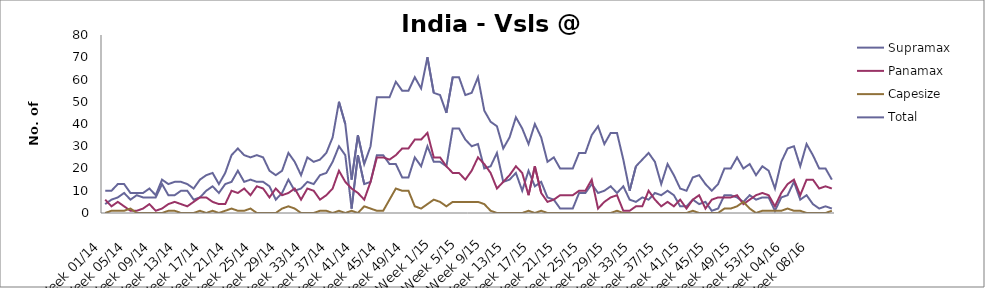
| Category | Supramax | Panamax | Capesize | Total |
|---|---|---|---|---|
| Week 01/14 | 4 | 6 | 0 | 10 |
| Week 02/14 | 6 | 3 | 1 | 10 |
| Week 03/14 | 7 | 5 | 1 | 13 |
| Week 04/14 | 9 | 3 | 1 | 13 |
| Week 05/14 | 6 | 1 | 2 | 9 |
| Week 06/14 | 8 | 1 | 0 | 9 |
| Week 07/14 | 7 | 2 | 0 | 9 |
| Week 08/14 | 7 | 4 | 0 | 11 |
| Week 09/14 | 7 | 1 | 0 | 8 |
| Week 10/14 | 13 | 2 | 0 | 15 |
| Week 11/14 | 8 | 4 | 1 | 13 |
| Week 12/14 | 8 | 5 | 1 | 14 |
| Week 13/14 | 10 | 4 | 0 | 14 |
| Week 14/14 | 10 | 3 | 0 | 13 |
| Week 15/14 | 6 | 5 | 0 | 11 |
| Week 16/14 | 7 | 7 | 1 | 15 |
| Week 17/14 | 10 | 7 | 0 | 17 |
| Week 18/14 | 12 | 5 | 1 | 18 |
| Week 19/14 | 9 | 4 | 0 | 13 |
| Week 20/14 | 13 | 4 | 1 | 18 |
| Week 21/14 | 14 | 10 | 2 | 26 |
| Week 22/14 | 19 | 9 | 1 | 29 |
| Week 23/14 | 14 | 11 | 1 | 26 |
| Week 24/14 | 15 | 8 | 2 | 25 |
| Week 25/14 | 14 | 12 | 0 | 26 |
| Week 26/14 | 14 | 11 | 0 | 25 |
| Week 27/14 | 12 | 7 | 0 | 19 |
| Week 28/14 | 6 | 11 | 0 | 17 |
| Week 29/14 | 9 | 8 | 2 | 19 |
| Week 30/14 | 15 | 9 | 3 | 27 |
| Week 31/14 | 10 | 11 | 2 | 23 |
| Week 32/14 | 11 | 6 | 0 | 17 |
| Week 33/14 | 14 | 11 | 0 | 25 |
| Week 34/14 | 13 | 10 | 0 | 23 |
| Week 35/14 | 17 | 6 | 1 | 24 |
| Week 36/14 | 18 | 8 | 1 | 27 |
| Week 37/14 | 23 | 11 | 0 | 34 |
| Week 38/14 | 30 | 19 | 1 | 50 |
| Week 39/14 | 26 | 14 | 0 | 40 |
| Week 40/14 | 2 | 11 | 1 | 15 |
| Week 41/14 | 26 | 9 | 0 | 35 |
| Week 42/14 | 13 | 6 | 3 | 22 |
| Week 43/14 | 14 | 14 | 2 | 30 |
| Week 44/14 | 26 | 25 | 1 | 52 |
| Week 45/14 | 26 | 25 | 1 | 52 |
| Week 46/14 | 22 | 24 | 6 | 52 |
| Week 47/14 | 22 | 26 | 11 | 59 |
| Week 48/14 | 16 | 29 | 10 | 55 |
| Week 49/14 | 16 | 29 | 10 | 55 |
| Week 50/14 | 25 | 33 | 3 | 61 |
| Week 51/14 | 21 | 33 | 2 | 56 |
| Week 52/14 | 30 | 36 | 4 | 70 |
| Week 1/15 | 23 | 25 | 6 | 54 |
| Week 2/15 | 23 | 25 | 5 | 53 |
| Week 3/15 | 21 | 21 | 3 | 45 |
| Week 4/15 | 38 | 18 | 5 | 61 |
| Week 5/15 | 38 | 18 | 5 | 61 |
| Week 6/15 | 33 | 15 | 5 | 53 |
| Week 7/15 | 30 | 19 | 5 | 54 |
| Week 8/15 | 31 | 25 | 5 | 61 |
| Week 9/15 | 20 | 22 | 4 | 46 |
| Week 10/15 | 21 | 18 | 1 | 41 |
| Week 11/15 | 27 | 11 | 0 | 39 |
| Week 12/15 | 14 | 14 | 0 | 29 |
| Week 13/15 | 15 | 17 | 0 | 34 |
| Week 14/15 | 18 | 21 | 0 | 43 |
| Week 15/15 | 10 | 18 | 0 | 38 |
| Week 16/15 | 19 | 8 | 1 | 31 |
| Week 17/15 | 12 | 21 | 0 | 40 |
| Week 18/15 | 14 | 9 | 1 | 34 |
| Week 19/15 | 7 | 5 | 0 | 23 |
| Week 20/15 | 6 | 6 | 0 | 25 |
| Week 21/15 | 2 | 8 | 0 | 20 |
| Week 22/15 | 2 | 8 | 0 | 20 |
| Week 23/15 | 2 | 8 | 0 | 20 |
| Week 24/15 | 9 | 10 | 0 | 27 |
| Week 25/15 | 9 | 10 | 0 | 27 |
| Week 26/15 | 13 | 15 | 0 | 35 |
| Week 27/15 | 9 | 2 | 0 | 39 |
| Week 28/15 | 10 | 5 | 0 | 31 |
| Week 29/15 | 12 | 7 | 0 | 36 |
| Week 30/15 | 9 | 8 | 1 | 36 |
| Week 31/15 | 12 | 1 | 0 | 24 |
| Week 32/15 | 6 | 1 | 0 | 10 |
| Week 33/15 | 5 | 3 | 0 | 21 |
| Week 34/15 | 7 | 3 | 0 | 24 |
| Week 35/15 | 6 | 10 | 0 | 27 |
| Week 36/15 | 9 | 6 | 0 | 23 |
| Week 37/15 | 8 | 3 | 0 | 13 |
| Week 38/15 | 10 | 5 | 0 | 22 |
| Week 39/15 | 8 | 3 | 0 | 17 |
| Week 40/15 | 3 | 6 | 0 | 11 |
| Week 41/15 | 3 | 2 | 0 | 10 |
| Week 42/15 | 6 | 6 | 1 | 16 |
| Week 43/15 | 4 | 8 | 0 | 17 |
| Week 44/15 | 5 | 2 | 0 | 13 |
| Week 45/15 | 1 | 6 | 0 | 10 |
| Week 46/15 | 2 | 7 | 0 | 13 |
| Week 47/15 | 8 | 7 | 2 | 20 |
| Week 48/15 | 8 | 7 | 2 | 20 |
| Week 49/15 | 7 | 8 | 3 | 25 |
| Week 50/15 | 5 | 4 | 5 | 20 |
| Week 51/15 | 8 | 6 | 2 | 22 |
| Week 52/15 | 6 | 8 | 0 | 17 |
| Week 53/15 | 7 | 9 | 1 | 21 |
| Week 01/16 | 7 | 8 | 1 | 19 |
| Week 02/16 | 1 | 3 | 1 | 11 |
| Week 03/16 | 7 | 9 | 1 | 23 |
| Week 04/16 | 8 | 13 | 2 | 29 |
| Week 05/16 | 14 | 15 | 1 | 30 |
| Week 06/16 | 6 | 8 | 1 | 21 |
| Week 07/16 | 8 | 15 | 0 | 31 |
| Week 08/16 | 4 | 15 | 0 | 26 |
| Week 09/16 | 2 | 11 | 0 | 20 |
| Week 10/16 | 3 | 12 | 0 | 20 |
| Week 11/16 | 2 | 11 | 1 | 15 |